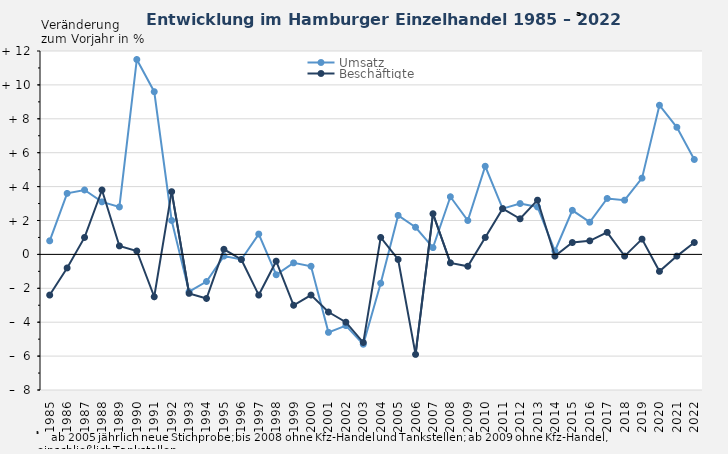
| Category | Umsatz | Beschäftigte |
|---|---|---|
| 1985.0 | 0.8 | -2.4 |
| 1986.0 | 3.6 | -0.8 |
| 1987.0 | 3.8 | 1 |
| 1988.0 | 3.1 | 3.8 |
| 1989.0 | 2.8 | 0.5 |
| 1990.0 | 11.5 | 0.2 |
| 1991.0 | 9.6 | -2.5 |
| 1992.0 | 2 | 3.7 |
| 1993.0 | -2.2 | -2.3 |
| 1994.0 | -1.6 | -2.6 |
| 1995.0 | -0.1 | 0.3 |
| 1996.0 | -0.3 | -0.3 |
| 1997.0 | 1.2 | -2.4 |
| 1998.0 | -1.2 | -0.4 |
| 1999.0 | -0.5 | -3 |
| 2000.0 | -0.7 | -2.4 |
| 2001.0 | -4.6 | -3.4 |
| 2002.0 | -4.2 | -4 |
| 2003.0 | -5.3 | -5.2 |
| 2004.0 | -1.7 | 1 |
| 2005.0 | 2.3 | -0.3 |
| 2006.0 | 1.6 | -5.9 |
| 2007.0 | 0.4 | 2.4 |
| 2008.0 | 3.4 | -0.5 |
| 2009.0 | 2 | -0.7 |
| 2010.0 | 5.2 | 1 |
| 2011.0 | 2.7 | 2.7 |
| 2012.0 | 3 | 2.1 |
| 2013.0 | 2.8 | 3.2 |
| 2014.0 | 0.2 | -0.1 |
| 2015.0 | 2.6 | 0.7 |
| 2016.0 | 1.9 | 0.8 |
| 2017.0 | 3.3 | 1.3 |
| 2018.0 | 3.2 | -0.1 |
| 2019.0 | 4.5 | 0.9 |
| 2020.0 | 8.8 | -1 |
| 2021.0 | 7.5 | -0.1 |
| 2022.0 | 5.6 | 0.7 |